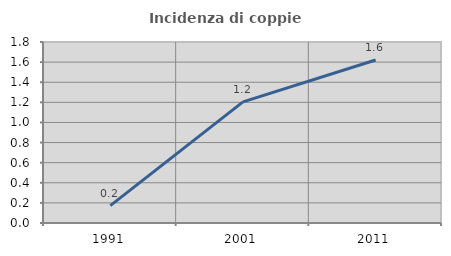
| Category | Incidenza di coppie miste |
|---|---|
| 1991.0 | 0.173 |
| 2001.0 | 1.205 |
| 2011.0 | 1.621 |